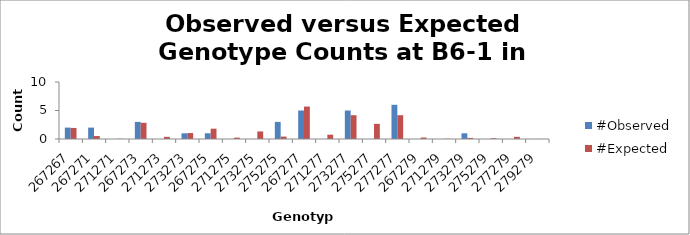
| Category | #Observed | #Expected |
|---|---|---|
| 267267.0 | 2 | 1.94 |
| 267271.0 | 2 | 0.517 |
| 271271.0 | 0 | 0.034 |
| 267273.0 | 3 | 2.845 |
| 271273.0 | 0 | 0.379 |
| 273273.0 | 1 | 1.043 |
| 267275.0 | 1 | 1.81 |
| 271275.0 | 0 | 0.241 |
| 273275.0 | 0 | 1.328 |
| 275275.0 | 3 | 0.422 |
| 267277.0 | 5 | 5.69 |
| 271277.0 | 0 | 0.759 |
| 273277.0 | 5 | 4.172 |
| 275277.0 | 0 | 2.655 |
| 277277.0 | 6 | 4.172 |
| 267279.0 | 0 | 0.259 |
| 271279.0 | 0 | 0.034 |
| 273279.0 | 1 | 0.19 |
| 275279.0 | 0 | 0.121 |
| 277279.0 | 0 | 0.379 |
| 279279.0 | 0 | 0.009 |